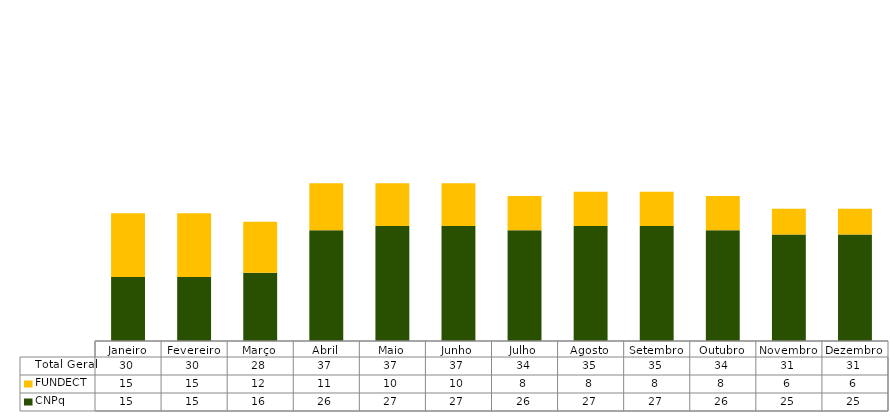
| Category | CNPq | FUNDECT | Total Geral |
|---|---|---|---|
| Janeiro | 15 | 15 | 30 |
| Fevereiro | 15 | 15 | 30 |
| Março | 16 | 12 | 28 |
| Abril | 26 | 11 | 37 |
| Maio | 27 | 10 | 37 |
| Junho | 27 | 10 | 37 |
| Julho | 26 | 8 | 34 |
| Agosto | 27 | 8 | 35 |
| Setembro | 27 | 8 | 35 |
| Outubro | 26 | 8 | 34 |
| Novembro | 25 | 6 | 31 |
| Dezembro | 25 | 6 | 31 |